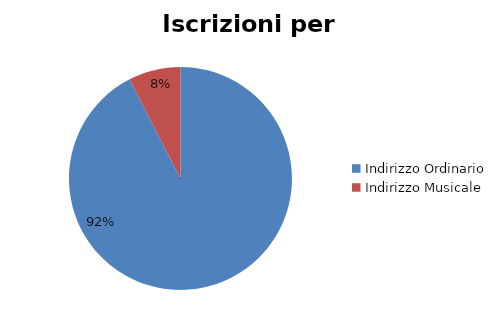
| Category | #REF! |
|---|---|
| Indirizzo Ordinario | 35962 |
| Indirizzo Musicale | 2939 |